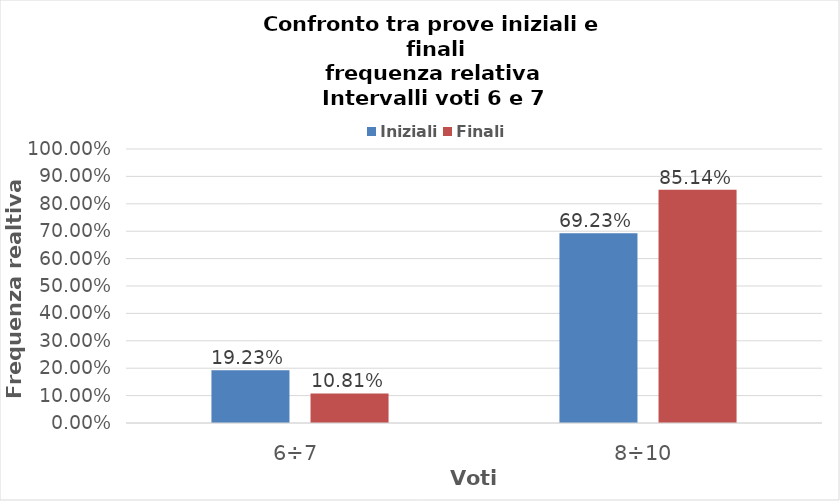
| Category | Iniziali | Finali |
|---|---|---|
| 6÷7 | 0.192 | 0.108 |
| 8÷10 | 0.692 | 0.851 |